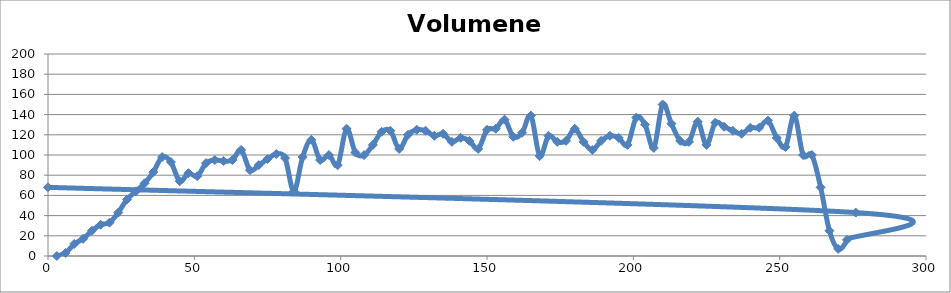
| Category | Volumenes |
|---|---|
| 3.0 | 0 |
| 6.0 | 3 |
| 9.0 | 12 |
| 12.0 | 17 |
| 15.0 | 25 |
| 18.0 | 31 |
| 21.0 | 33 |
| 24.0 | 43 |
| 27.0 | 56 |
| 30.0 | 64 |
| 33.0 | 72 |
| 36.0 | 83 |
| 39.0 | 98 |
| 42.0 | 93 |
| 45.0 | 74 |
| 48.0 | 82 |
| 51.0 | 79 |
| 54.0 | 92 |
| 57.0 | 95 |
| 60.0 | 94 |
| 63.0 | 95 |
| 66.0 | 105 |
| 69.0 | 85 |
| 72.0 | 90 |
| 75.0 | 96 |
| 78.0 | 101 |
| 81.0 | 97 |
| 84.0 | 64 |
| 87.0 | 98 |
| 90.0 | 115 |
| 93.0 | 95 |
| 96.0 | 100 |
| 99.0 | 90 |
| 102.0 | 126 |
| 105.0 | 102.5 |
| 108.0 | 99.9 |
| 111.0 | 110 |
| 114.0 | 123 |
| 117.0 | 124 |
| 120.0 | 106 |
| 123.0 | 120 |
| 126.0 | 125 |
| 129.0 | 124 |
| 132.0 | 119 |
| 135.0 | 121 |
| 138.0 | 113 |
| 141.0 | 117 |
| 144.0 | 114 |
| 147.0 | 106 |
| 150.0 | 125 |
| 153.0 | 126 |
| 156.0 | 135 |
| 159.0 | 118 |
| 162.0 | 122 |
| 165.0 | 139 |
| 168.0 | 99 |
| 171.0 | 119 |
| 174.0 | 113 |
| 177.0 | 114 |
| 180.0 | 126 |
| 183.0 | 113 |
| 186.0 | 105 |
| 189.0 | 114 |
| 192.0 | 119 |
| 195.0 | 117 |
| 198.0 | 110 |
| 201.0 | 137 |
| 204.0 | 130 |
| 207.0 | 107 |
| 210.0 | 150 |
| 213.0 | 131 |
| 216.0 | 114 |
| 219.0 | 113 |
| 222.0 | 133 |
| 225.0 | 110 |
| 228.0 | 132 |
| 231.0 | 128 |
| 234.0 | 124 |
| 237.0 | 121 |
| 240.0 | 127 |
| 243.0 | 127 |
| 246.0 | 134 |
| 249.0 | 117 |
| 252.0 | 108 |
| 255.0 | 139 |
| 258.0 | 100 |
| 261.0 | 100 |
| 264.0 | 68 |
| 267.0 | 25 |
| 270.0 | 7 |
| 273.0 | 16 |
| 276.0 | 43 |